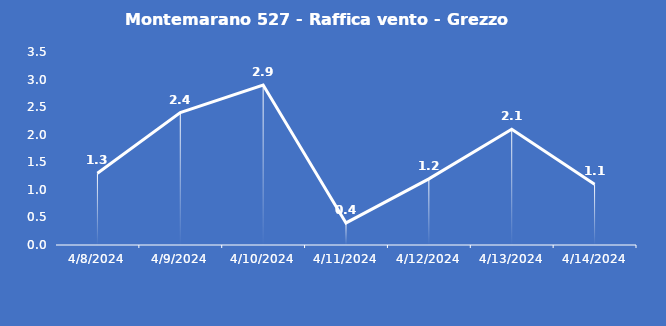
| Category | Montemarano 527 - Raffica vento - Grezzo (m/s) |
|---|---|
| 4/8/24 | 1.3 |
| 4/9/24 | 2.4 |
| 4/10/24 | 2.9 |
| 4/11/24 | 0.4 |
| 4/12/24 | 1.2 |
| 4/13/24 | 2.1 |
| 4/14/24 | 1.1 |